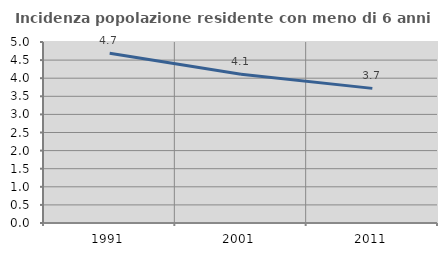
| Category | Incidenza popolazione residente con meno di 6 anni |
|---|---|
| 1991.0 | 4.69 |
| 2001.0 | 4.108 |
| 2011.0 | 3.719 |